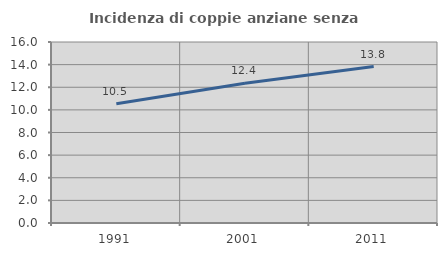
| Category | Incidenza di coppie anziane senza figli  |
|---|---|
| 1991.0 | 10.545 |
| 2001.0 | 12.362 |
| 2011.0 | 13.832 |